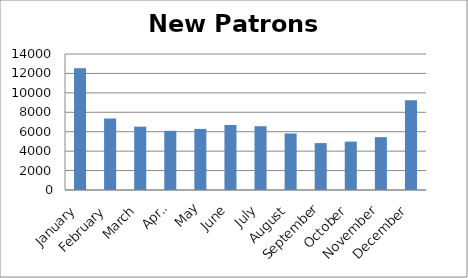
| Category | Series 0 |
|---|---|
| January | 12521 |
| February | 7359 |
| March | 6521 |
| April | 6091 |
| May | 6290 |
| June | 6699 |
| July | 6564 |
| August | 5816 |
| September | 4828 |
| October | 4980 |
| November | 5438 |
| December | 9235 |